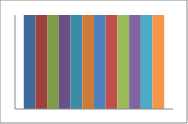
| Category | Series 1 | Series 2 | Series 3 | Series 4 | Series 5 | Series 6 | Series 7 | Series 8 | Series 9 | Series 10 | Series 11 | Series 12 |
|---|---|---|---|---|---|---|---|---|---|---|---|---|
| Point 1 | 1 | 1 | 1 | 1 | 1 | 1 | 1 | 1 | 1 | 1 | 1 | 1 |